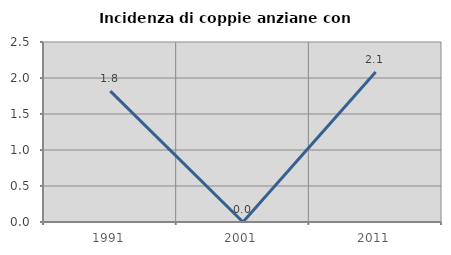
| Category | Incidenza di coppie anziane con figli |
|---|---|
| 1991.0 | 1.818 |
| 2001.0 | 0 |
| 2011.0 | 2.083 |